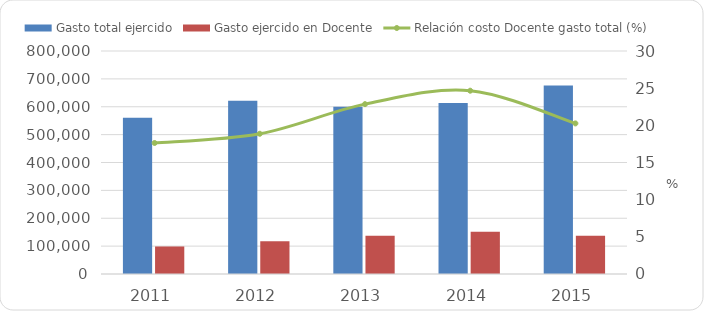
| Category | Gasto total ejercido | Gasto ejercido en Docente |
|---|---|---|
| 2011 | 560225 | 98742 |
| 2012 | 621909.5 | 117330.865 |
| 2013 | 600163.1 | 137147.673 |
| 2014 | 613052.1 | 151173.245 |
| 2015 | 676403.338 | 137024.068 |